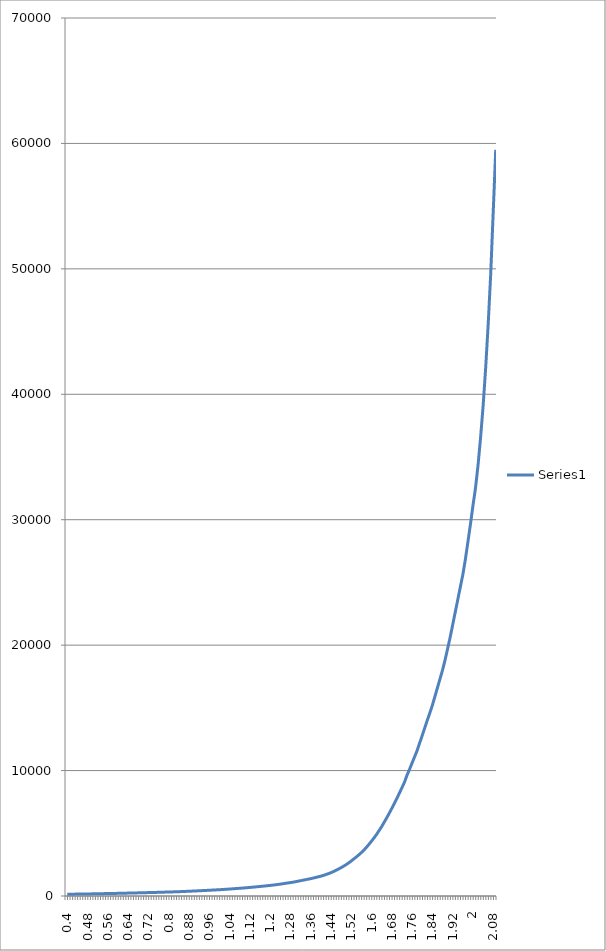
| Category | Series 0 |
|---|---|
| 0.4 | 140 |
| 0.41 | 143 |
| 0.42 | 146 |
| 0.43 | 149 |
| 0.44 | 152 |
| 0.45 | 155 |
| 0.46 | 158 |
| 0.47 | 161 |
| 0.48 | 164 |
| 0.49 | 167 |
| 0.5 | 171 |
| 0.509999999999999 | 175 |
| 0.519999999999999 | 179 |
| 0.529999999999999 | 183 |
| 0.539999999999999 | 187 |
| 0.549999999999999 | 191 |
| 0.559999999999999 | 195 |
| 0.569999999999999 | 199 |
| 0.579999999999999 | 203 |
| 0.589999999999999 | 207 |
| 0.599999999999999 | 211 |
| 0.609999999999999 | 216 |
| 0.619999999999999 | 221 |
| 0.629999999999999 | 226 |
| 0.639999999999999 | 231 |
| 0.649999999999999 | 236 |
| 0.659999999999999 | 241 |
| 0.669999999999999 | 246 |
| 0.679999999999999 | 251 |
| 0.689999999999999 | 256 |
| 0.699999999999999 | 261 |
| 0.709999999999999 | 266 |
| 0.719999999999999 | 271 |
| 0.729999999999998 | 276 |
| 0.739999999999998 | 281 |
| 0.749999999999998 | 287 |
| 0.759999999999998 | 293 |
| 0.769999999999998 | 299 |
| 0.779999999999998 | 306 |
| 0.789999999999998 | 312 |
| 0.799999999999998 | 318 |
| 0.809999999999998 | 324 |
| 0.819999999999998 | 330 |
| 0.829999999999998 | 337 |
| 0.839999999999998 | 344 |
| 0.849999999999998 | 352 |
| 0.859999999999998 | 360 |
| 0.869999999999998 | 369 |
| 0.879999999999998 | 378 |
| 0.889999999999998 | 387 |
| 0.899999999999998 | 397 |
| 0.909999999999998 | 407 |
| 0.919999999999998 | 417 |
| 0.929999999999998 | 427 |
| 0.939999999999997 | 437 |
| 0.949999999999997 | 447 |
| 0.959999999999997 | 458 |
| 0.969999999999997 | 469 |
| 0.979999999999997 | 480 |
| 0.989999999999997 | 491 |
| 0.999999999999997 | 502 |
| 1.01 | 514 |
| 1.02 | 527 |
| 1.03 | 541 |
| 1.04 | 555 |
| 1.05 | 570 |
| 1.06 | 585 |
| 1.07 | 600 |
| 1.08 | 615 |
| 1.09 | 631 |
| 1.1 | 647 |
| 1.11 | 664 |
| 1.12 | 682 |
| 1.13 | 701 |
| 1.14 | 720 |
| 1.15 | 739 |
| 1.16 | 759 |
| 1.17 | 779 |
| 1.18 | 800 |
| 1.19 | 821 |
| 1.2 | 843 |
| 1.21 | 866 |
| 1.22 | 891 |
| 1.23 | 918 |
| 1.24 | 946 |
| 1.25 | 976 |
| 1.26 | 1010 |
| 1.27 | 1040 |
| 1.28 | 1070 |
| 1.29 | 1100 |
| 1.3 | 1140 |
| 1.31 | 1180 |
| 1.32 | 1220 |
| 1.33 | 1260 |
| 1.34 | 1300 |
| 1.35 | 1340 |
| 1.36 | 1380 |
| 1.37 | 1430 |
| 1.38 | 1480 |
| 1.39 | 1530 |
| 1.4 | 1580 |
| 1.41 | 1640 |
| 1.42 | 1710 |
| 1.43 | 1780 |
| 1.44 | 1860 |
| 1.45 | 1950 |
| 1.46 | 2050 |
| 1.46999999999999 | 2150 |
| 1.47999999999999 | 2260 |
| 1.48999999999999 | 2380 |
| 1.49999999999999 | 2500 |
| 1.50999999999999 | 2640 |
| 1.51999999999999 | 2790 |
| 1.52999999999999 | 2950 |
| 1.53999999999999 | 3110 |
| 1.54999999999999 | 3280 |
| 1.55999999999999 | 3460 |
| 1.56999999999999 | 3660 |
| 1.57999999999999 | 3880 |
| 1.58999999999999 | 4120 |
| 1.59999999999999 | 4370 |
| 1.60999999999999 | 4630 |
| 1.61999999999999 | 4910 |
| 1.62999999999999 | 5220 |
| 1.63999999999999 | 5530 |
| 1.64999999999999 | 5880 |
| 1.65999999999999 | 6230 |
| 1.66999999999999 | 6600 |
| 1.67999999999999 | 6980 |
| 1.68999999999999 | 7370 |
| 1.69999999999999 | 7780 |
| 1.70999999999999 | 8200 |
| 1.71999999999999 | 8630 |
| 1.72999999999999 | 9070 |
| 1.73999999999999 | 9630 |
| 1.74999999999999 | 10100 |
| 1.75999999999999 | 10600 |
| 1.76999999999999 | 11100 |
| 1.77999999999999 | 11600 |
| 1.78999999999999 | 12200 |
| 1.79999999999999 | 12800 |
| 1.80999999999999 | 13400 |
| 1.81999999999999 | 14000 |
| 1.82999999999999 | 14600 |
| 1.83999999999999 | 15200 |
| 1.84999999999999 | 15900 |
| 1.85999999999999 | 16600 |
| 1.86999999999999 | 17300 |
| 1.87999999999999 | 18000 |
| 1.88999999999999 | 18800 |
| 1.89999999999999 | 19700 |
| 1.90999999999999 | 20600 |
| 1.91999999999999 | 21600 |
| 1.92999999999999 | 22600 |
| 1.93999999999999 | 23600 |
| 1.94999999999999 | 24600 |
| 1.95999999999999 | 25600 |
| 1.96999999999999 | 26800 |
| 1.97999999999999 | 28200 |
| 1.98999999999999 | 29600 |
| 1.99999999999999 | 31100 |
| 2.00999999999999 | 32500 |
| 2.01999999999999 | 34300 |
| 2.02999999999999 | 36500 |
| 2.03999999999999 | 39000 |
| 2.04999999999999 | 42000 |
| 2.05999999999999 | 45500 |
| 2.06999999999999 | 49500 |
| 2.07999999999999 | 54500 |
| 2.08999999999999 | 59500 |